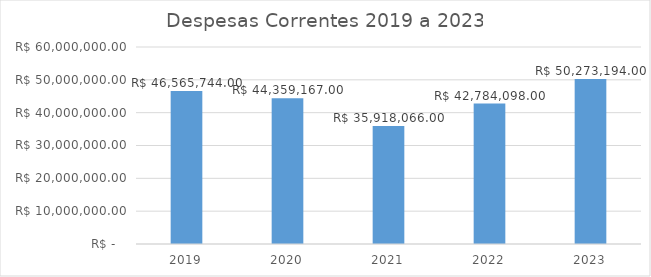
| Category | Despesas Correntes 2019 a 2023 |
|---|---|
| 2019.0 | 46565744 |
| 2020.0 | 44359167 |
| 2021.0 | 35918066 |
| 2022.0 | 42784098 |
| 2023.0 | 50273194 |